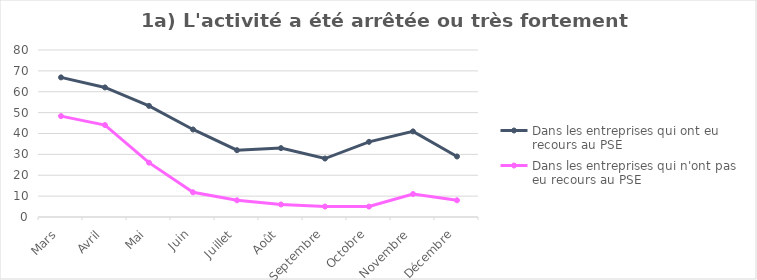
| Category | Dans les entreprises qui ont eu recours au PSE  | Dans les entreprises qui n'ont pas eu recours au PSE  |
|---|---|---|
| Mars | 66.884 | 48.337 |
| Avril | 62.074 | 44.035 |
| Mai | 53.242 | 26.024 |
| Juin | 41.929 | 11.834 |
| Juillet | 32 | 8 |
| Août | 33 | 6 |
| Septembre | 28 | 5 |
| Octobre | 36 | 5 |
| Novembre | 41 | 11 |
| Décembre | 29 | 8 |